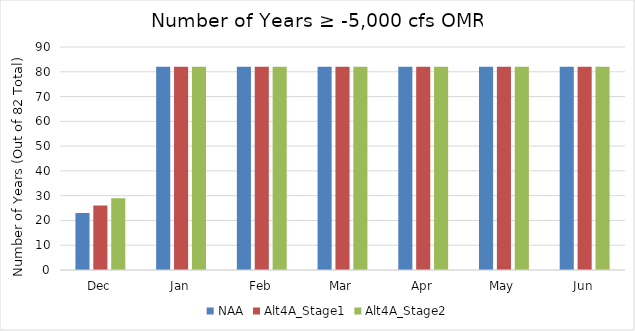
| Category | NAA | Alt4A_Stage1 | Alt4A_Stage2 |
|---|---|---|---|
| Dec | 23 | 26 | 29 |
| Jan | 82 | 82 | 82 |
| Feb | 82 | 82 | 82 |
| Mar | 82 | 82 | 82 |
| Apr | 82 | 82 | 82 |
| May | 82 | 82 | 82 |
| Jun | 82 | 82 | 82 |